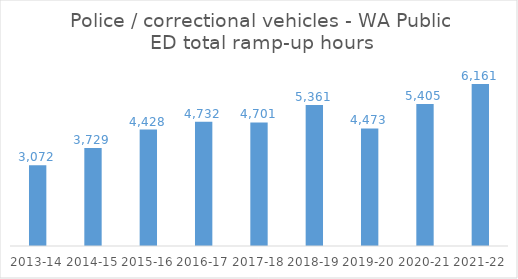
| Category | Police / correctional vehicles - WA Public ED total ramping hours |
|---|---|
| 2013-14 | 3072 |
| 2014-15 | 3728.75 |
| 2015-16 | 4427.55 |
| 2016-17 | 4731.533 |
| 2017-18 | 4701.2 |
| 2018-19 | 5361.067 |
| 2019-20 | 4473.333 |
| 2020-21 | 5404.85 |
| 2021-22 | 6160.667 |